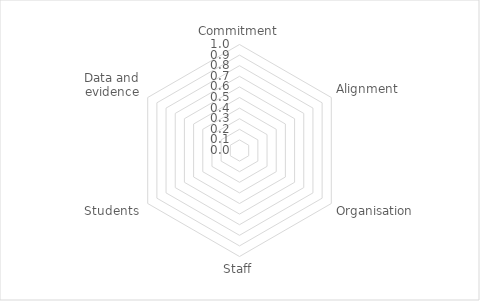
| Category | Series 0 |
|---|---|
| Commitment | 0 |
| Alignment | 0 |
| Organisation | 0 |
| Staff | 0 |
| Students | 0 |
| Data and evidence | 0 |